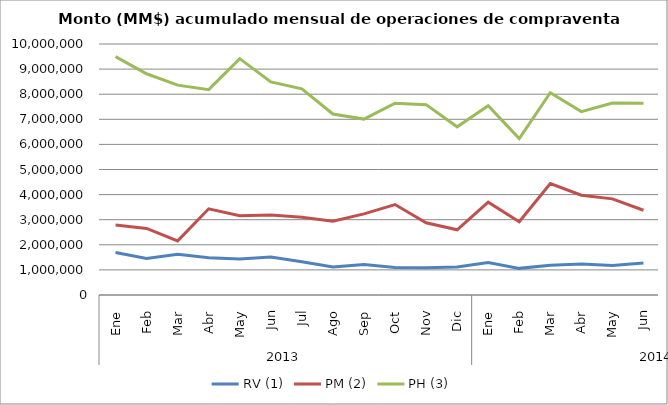
| Category | RV (1) | PM (2) | PH (3) |
|---|---|---|---|
| 0 | 1693090.019 | 2788692.01 | 9495719.157 |
| 1 | 1457870.523 | 2652319.476 | 8814454.346 |
| 2 | 1619570.46 | 2155113.626 | 8361658.957 |
| 3 | 1485677.791 | 3434435.881 | 8182321.991 |
| 4 | 1434943.507 | 3155786.06 | 9417818.094 |
| 5 | 1516566.545 | 3191285.457 | 8490151.421 |
| 6 | 1322115.523 | 3099755.507 | 8212010.547 |
| 7 | 1118245.895 | 2937089.197 | 7211658.784 |
| 8 | 1215047.725 | 3232334.418 | 7008526.172 |
| 9 | 1092035.083 | 3603082.09 | 7640993.748 |
| 10 | 1088055.605 | 2879188.198 | 7583918.365 |
| 11 | 1114851.326 | 2596986.123 | 6700659.979 |
| 12 | 1296256.43 | 3700290.091 | 7538361.261 |
| 13 | 1061199.219 | 2915830.381 | 6230064.605 |
| 14 | 1189463.212 | 4440910.02 | 8058380.739 |
| 15 | 1231035.305 | 3977428.452 | 7305106.144 |
| 16 | 1178985.046 | 3830415.456 | 7649023.753 |
| 17 | 1271543.287 | 3377453.657 | 7635505.378 |